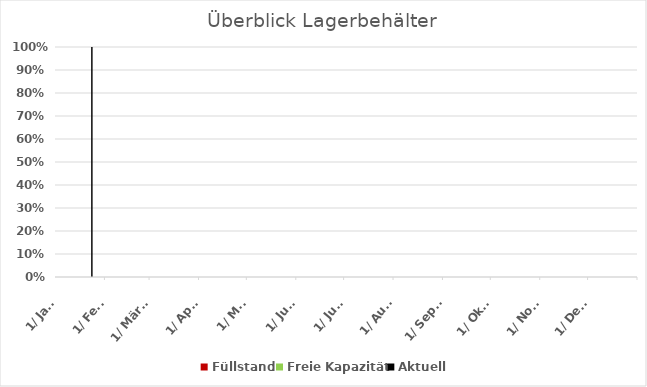
| Category | Aktuell |
|---|---|
| 2023-01-01 | 0 |
| 2023-01-02 | 0 |
| 2023-01-03 | 0 |
| 2023-01-04 | 0 |
| 2023-01-05 | 0 |
| 2023-01-06 | 0 |
| 2023-01-07 | 0 |
| 2023-01-08 | 0 |
| 2023-01-09 | 0 |
| 2023-01-10 | 0 |
| 2023-01-11 | 0 |
| 2023-01-12 | 0 |
| 2023-01-13 | 0 |
| 2023-01-14 | 0 |
| 2023-01-15 | 0 |
| 2023-01-16 | 0 |
| 2023-01-17 | 0 |
| 2023-01-18 | 0 |
| 2023-01-19 | 0 |
| 2023-01-20 | 0 |
| 2023-01-21 | 0 |
| 2023-01-22 | 0 |
| 2023-01-23 | 100 |
| 2023-01-24 | 0 |
| 2023-01-25 | 0 |
| 2023-01-26 | 0 |
| 2023-01-27 | 0 |
| 2023-01-28 | 0 |
| 2023-01-29 | 0 |
| 2023-01-30 | 0 |
| 2023-01-31 | 0 |
| 2023-02-01 | 0 |
| 2023-02-02 | 0 |
| 2023-02-03 | 0 |
| 2023-02-04 | 0 |
| 2023-02-05 | 0 |
| 2023-02-06 | 0 |
| 2023-02-07 | 0 |
| 2023-02-08 | 0 |
| 2023-02-09 | 0 |
| 2023-02-10 | 0 |
| 2023-02-11 | 0 |
| 2023-02-12 | 0 |
| 2023-02-13 | 0 |
| 2023-02-14 | 0 |
| 2023-02-15 | 0 |
| 2023-02-16 | 0 |
| 2023-02-17 | 0 |
| 2023-02-18 | 0 |
| 2023-02-19 | 0 |
| 2023-02-20 | 0 |
| 2023-02-21 | 0 |
| 2023-02-22 | 0 |
| 2023-02-23 | 0 |
| 2023-02-24 | 0 |
| 2023-02-25 | 0 |
| 2023-02-26 | 0 |
| 2023-02-27 | 0 |
| 2023-02-28 | 0 |
| 2023-03-01 | 0 |
| 2023-03-02 | 0 |
| 2023-03-03 | 0 |
| 2023-03-04 | 0 |
| 2023-03-05 | 0 |
| 2023-03-06 | 0 |
| 2023-03-07 | 0 |
| 2023-03-08 | 0 |
| 2023-03-09 | 0 |
| 2023-03-10 | 0 |
| 2023-03-11 | 0 |
| 2023-03-12 | 0 |
| 2023-03-13 | 0 |
| 2023-03-14 | 0 |
| 2023-03-15 | 0 |
| 2023-03-16 | 0 |
| 2023-03-17 | 0 |
| 2023-03-18 | 0 |
| 2023-03-19 | 0 |
| 2023-03-20 | 0 |
| 2023-03-21 | 0 |
| 2023-03-22 | 0 |
| 2023-03-23 | 0 |
| 2023-03-24 | 0 |
| 2023-03-25 | 0 |
| 2023-03-26 | 0 |
| 2023-03-27 | 0 |
| 2023-03-28 | 0 |
| 2023-03-29 | 0 |
| 2023-03-30 | 0 |
| 2023-03-31 | 0 |
| 2023-04-01 | 0 |
| 2023-04-02 | 0 |
| 2023-04-03 | 0 |
| 2023-04-04 | 0 |
| 2023-04-05 | 0 |
| 2023-04-06 | 0 |
| 2023-04-07 | 0 |
| 2023-04-08 | 0 |
| 2023-04-09 | 0 |
| 2023-04-10 | 0 |
| 2023-04-11 | 0 |
| 2023-04-12 | 0 |
| 2023-04-13 | 0 |
| 2023-04-14 | 0 |
| 2023-04-15 | 0 |
| 2023-04-16 | 0 |
| 2023-04-17 | 0 |
| 2023-04-18 | 0 |
| 2023-04-19 | 0 |
| 2023-04-20 | 0 |
| 2023-04-21 | 0 |
| 2023-04-22 | 0 |
| 2023-04-23 | 0 |
| 2023-04-24 | 0 |
| 2023-04-25 | 0 |
| 2023-04-26 | 0 |
| 2023-04-27 | 0 |
| 2023-04-28 | 0 |
| 2023-04-29 | 0 |
| 2023-04-30 | 0 |
| 2023-05-01 | 0 |
| 2023-05-02 | 0 |
| 2023-05-03 | 0 |
| 2023-05-04 | 0 |
| 2023-05-05 | 0 |
| 2023-05-06 | 0 |
| 2023-05-07 | 0 |
| 2023-05-08 | 0 |
| 2023-05-09 | 0 |
| 2023-05-10 | 0 |
| 2023-05-11 | 0 |
| 2023-05-12 | 0 |
| 2023-05-13 | 0 |
| 2023-05-14 | 0 |
| 2023-05-15 | 0 |
| 2023-05-16 | 0 |
| 2023-05-17 | 0 |
| 2023-05-18 | 0 |
| 2023-05-19 | 0 |
| 2023-05-20 | 0 |
| 2023-05-21 | 0 |
| 2023-05-22 | 0 |
| 2023-05-23 | 0 |
| 2023-05-24 | 0 |
| 2023-05-25 | 0 |
| 2023-05-26 | 0 |
| 2023-05-27 | 0 |
| 2023-05-28 | 0 |
| 2023-05-29 | 0 |
| 2023-05-30 | 0 |
| 2023-05-31 | 0 |
| 2023-06-01 | 0 |
| 2023-06-02 | 0 |
| 2023-06-03 | 0 |
| 2023-06-04 | 0 |
| 2023-06-05 | 0 |
| 2023-06-06 | 0 |
| 2023-06-07 | 0 |
| 2023-06-08 | 0 |
| 2023-06-09 | 0 |
| 2023-06-10 | 0 |
| 2023-06-11 | 0 |
| 2023-06-12 | 0 |
| 2023-06-13 | 0 |
| 2023-06-14 | 0 |
| 2023-06-15 | 0 |
| 2023-06-16 | 0 |
| 2023-06-17 | 0 |
| 2023-06-18 | 0 |
| 2023-06-19 | 0 |
| 2023-06-20 | 0 |
| 2023-06-21 | 0 |
| 2023-06-22 | 0 |
| 2023-06-23 | 0 |
| 2023-06-24 | 0 |
| 2023-06-25 | 0 |
| 2023-06-26 | 0 |
| 2023-06-27 | 0 |
| 2023-06-28 | 0 |
| 2023-06-29 | 0 |
| 2023-06-30 | 0 |
| 2023-07-01 | 0 |
| 2023-07-02 | 0 |
| 2023-07-03 | 0 |
| 2023-07-04 | 0 |
| 2023-07-05 | 0 |
| 2023-07-06 | 0 |
| 2023-07-07 | 0 |
| 2023-07-08 | 0 |
| 2023-07-09 | 0 |
| 2023-07-10 | 0 |
| 2023-07-11 | 0 |
| 2023-07-12 | 0 |
| 2023-07-13 | 0 |
| 2023-07-14 | 0 |
| 2023-07-15 | 0 |
| 2023-07-16 | 0 |
| 2023-07-17 | 0 |
| 2023-07-18 | 0 |
| 2023-07-19 | 0 |
| 2023-07-20 | 0 |
| 2023-07-21 | 0 |
| 2023-07-22 | 0 |
| 2023-07-23 | 0 |
| 2023-07-24 | 0 |
| 2023-07-25 | 0 |
| 2023-07-26 | 0 |
| 2023-07-27 | 0 |
| 2023-07-28 | 0 |
| 2023-07-29 | 0 |
| 2023-07-30 | 0 |
| 2023-07-31 | 0 |
| 2023-08-01 | 0 |
| 2023-08-02 | 0 |
| 2023-08-03 | 0 |
| 2023-08-04 | 0 |
| 2023-08-05 | 0 |
| 2023-08-06 | 0 |
| 2023-08-07 | 0 |
| 2023-08-08 | 0 |
| 2023-08-09 | 0 |
| 2023-08-10 | 0 |
| 2023-08-11 | 0 |
| 2023-08-12 | 0 |
| 2023-08-13 | 0 |
| 2023-08-14 | 0 |
| 2023-08-15 | 0 |
| 2023-08-16 | 0 |
| 2023-08-17 | 0 |
| 2023-08-18 | 0 |
| 2023-08-19 | 0 |
| 2023-08-20 | 0 |
| 2023-08-21 | 0 |
| 2023-08-22 | 0 |
| 2023-08-23 | 0 |
| 2023-08-24 | 0 |
| 2023-08-25 | 0 |
| 2023-08-26 | 0 |
| 2023-08-27 | 0 |
| 2023-08-28 | 0 |
| 2023-08-29 | 0 |
| 2023-08-30 | 0 |
| 2023-08-31 | 0 |
| 2023-09-01 | 0 |
| 2023-09-02 | 0 |
| 2023-09-03 | 0 |
| 2023-09-04 | 0 |
| 2023-09-05 | 0 |
| 2023-09-06 | 0 |
| 2023-09-07 | 0 |
| 2023-09-08 | 0 |
| 2023-09-09 | 0 |
| 2023-09-10 | 0 |
| 2023-09-11 | 0 |
| 2023-09-12 | 0 |
| 2023-09-13 | 0 |
| 2023-09-14 | 0 |
| 2023-09-15 | 0 |
| 2023-09-16 | 0 |
| 2023-09-17 | 0 |
| 2023-09-18 | 0 |
| 2023-09-19 | 0 |
| 2023-09-20 | 0 |
| 2023-09-21 | 0 |
| 2023-09-22 | 0 |
| 2023-09-23 | 0 |
| 2023-09-24 | 0 |
| 2023-09-25 | 0 |
| 2023-09-26 | 0 |
| 2023-09-27 | 0 |
| 2023-09-28 | 0 |
| 2023-09-29 | 0 |
| 2023-09-30 | 0 |
| 2023-10-01 | 0 |
| 2023-10-02 | 0 |
| 2023-10-03 | 0 |
| 2023-10-04 | 0 |
| 2023-10-05 | 0 |
| 2023-10-06 | 0 |
| 2023-10-07 | 0 |
| 2023-10-08 | 0 |
| 2023-10-09 | 0 |
| 2023-10-10 | 0 |
| 2023-10-11 | 0 |
| 2023-10-12 | 0 |
| 2023-10-13 | 0 |
| 2023-10-14 | 0 |
| 2023-10-15 | 0 |
| 2023-10-16 | 0 |
| 2023-10-17 | 0 |
| 2023-10-18 | 0 |
| 2023-10-19 | 0 |
| 2023-10-20 | 0 |
| 2023-10-21 | 0 |
| 2023-10-22 | 0 |
| 2023-10-23 | 0 |
| 2023-10-24 | 0 |
| 2023-10-25 | 0 |
| 2023-10-26 | 0 |
| 2023-10-27 | 0 |
| 2023-10-28 | 0 |
| 2023-10-29 | 0 |
| 2023-10-30 | 0 |
| 2023-10-31 | 0 |
| 2023-11-01 | 0 |
| 2023-11-02 | 0 |
| 2023-11-03 | 0 |
| 2023-11-04 | 0 |
| 2023-11-05 | 0 |
| 2023-11-06 | 0 |
| 2023-11-07 | 0 |
| 2023-11-08 | 0 |
| 2023-11-09 | 0 |
| 2023-11-10 | 0 |
| 2023-11-11 | 0 |
| 2023-11-12 | 0 |
| 2023-11-13 | 0 |
| 2023-11-14 | 0 |
| 2023-11-15 | 0 |
| 2023-11-16 | 0 |
| 2023-11-17 | 0 |
| 2023-11-18 | 0 |
| 2023-11-19 | 0 |
| 2023-11-20 | 0 |
| 2023-11-21 | 0 |
| 2023-11-22 | 0 |
| 2023-11-23 | 0 |
| 2023-11-24 | 0 |
| 2023-11-25 | 0 |
| 2023-11-26 | 0 |
| 2023-11-27 | 0 |
| 2023-11-28 | 0 |
| 2023-11-29 | 0 |
| 2023-11-30 | 0 |
| 2023-12-01 | 0 |
| 2023-12-02 | 0 |
| 2023-12-03 | 0 |
| 2023-12-04 | 0 |
| 2023-12-05 | 0 |
| 2023-12-06 | 0 |
| 2023-12-07 | 0 |
| 2023-12-08 | 0 |
| 2023-12-09 | 0 |
| 2023-12-10 | 0 |
| 2023-12-11 | 0 |
| 2023-12-12 | 0 |
| 2023-12-13 | 0 |
| 2023-12-14 | 0 |
| 2023-12-15 | 0 |
| 2023-12-16 | 0 |
| 2023-12-17 | 0 |
| 2023-12-18 | 0 |
| 2023-12-19 | 0 |
| 2023-12-20 | 0 |
| 2023-12-21 | 0 |
| 2023-12-22 | 0 |
| 2023-12-23 | 0 |
| 2023-12-24 | 0 |
| 2023-12-25 | 0 |
| 2023-12-26 | 0 |
| 2023-12-27 | 0 |
| 2023-12-28 | 0 |
| 2023-12-29 | 0 |
| 2023-12-30 | 0 |
| 2023-12-31 | 0 |